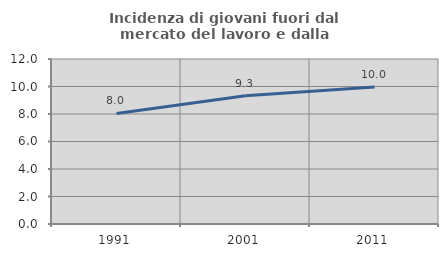
| Category | Incidenza di giovani fuori dal mercato del lavoro e dalla formazione  |
|---|---|
| 1991.0 | 8.038 |
| 2001.0 | 9.323 |
| 2011.0 | 9.955 |